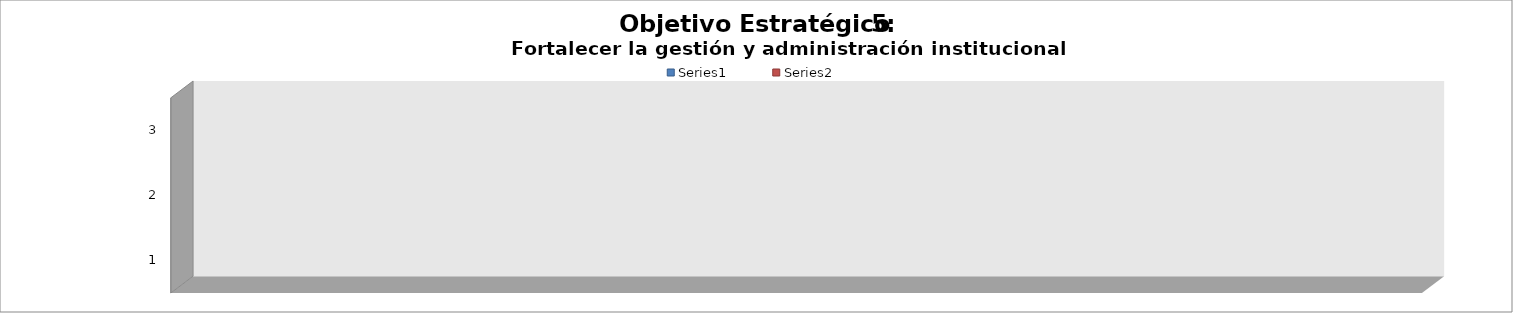
| Category | Series 0 | Series 1 |
|---|---|---|
| 0 | 0.875 | 0.125 |
| 1 | 0 | 1 |
| 2 | 0.438 | 0.562 |